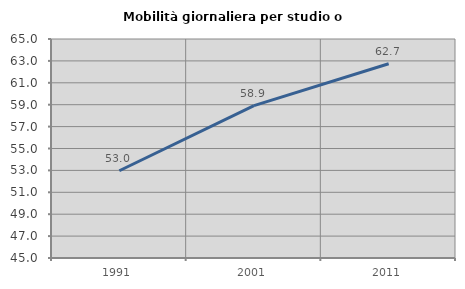
| Category | Mobilità giornaliera per studio o lavoro |
|---|---|
| 1991.0 | 52.969 |
| 2001.0 | 58.915 |
| 2011.0 | 62.736 |